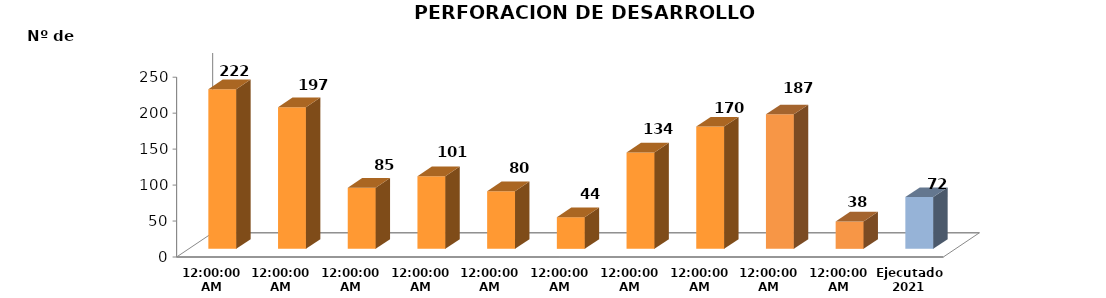
| Category | Series 0 |
|---|---|
| 2011 | 222 |
| 2012 | 197 |
| 2013 | 85 |
| 2014 | 101 |
| 2015 | 80 |
| 2016 | 44 |
| 2017 | 134 |
| 2018 | 170 |
| 2019 | 187 |
| 2020 | 38 |
| Ejecutado
2021 | 72 |